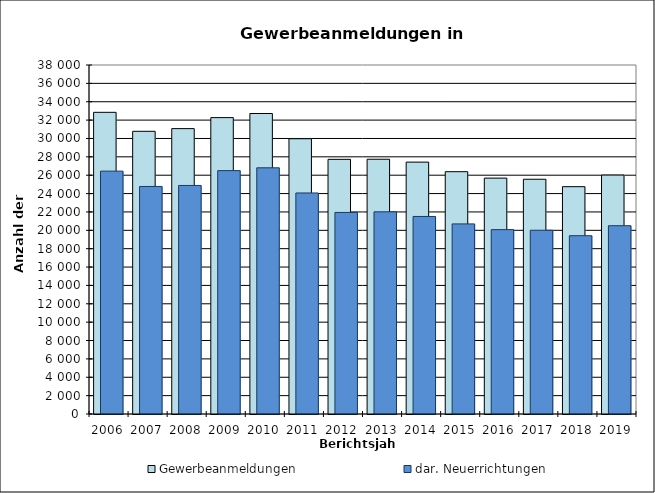
| Category | Gewerbeanmeldungen | dar. Neuerrichtungen |
|---|---|---|
| 2006.0 | 32847 | 26444 |
| 2007.0 | 30781 | 24775 |
| 2008.0 | 31074 | 24884 |
| 2009.0 | 32271 | 26499 |
| 2010.0 | 32718 | 26806 |
| 2011.0 | 29971 | 24066 |
| 2012.0 | 27728 | 21948 |
| 2013.0 | 27739 | 22013 |
| 2014.0 | 27426 | 21509 |
| 2015.0 | 26383 | 20698 |
| 2016.0 | 25683 | 20075 |
| 2017.0 | 25561 | 20008 |
| 2018.0 | 24752 | 19413 |
| 2019.0 | 26015 | 20501 |